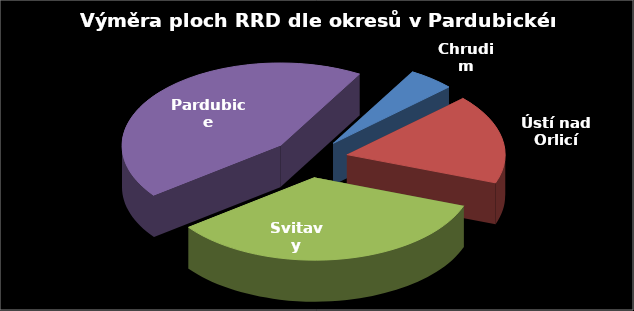
| Category | Výměra [ha] |
|---|---|
| Chrudim | 7.25 |
| Ústí nad Orlicí | 26.85 |
| Svitavy | 52.42 |
| Pardubice | 66.97 |